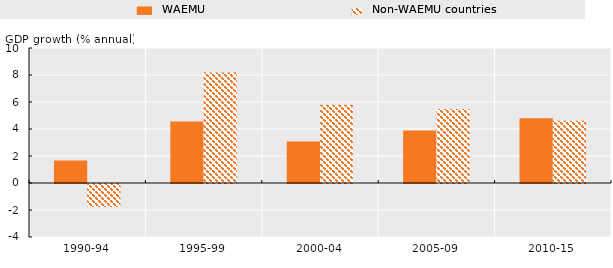
| Category | WAEMU | Non-WAEMU countries |
|---|---|---|
| 1990-94 | 1.673 | -1.697 |
| 1995-99 | 4.561 | 8.185 |
| 2000-04 | 3.073 | 5.8 |
| 2005-09 | 3.891 | 5.476 |
| 2010-15 | 4.788 | 4.604 |